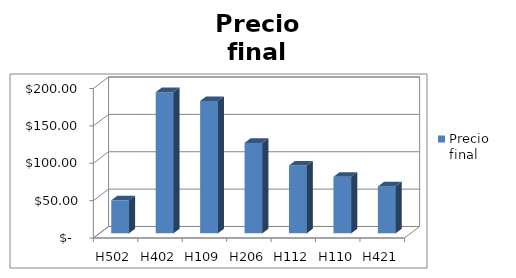
| Category | Precio
final |
|---|---|
| H502 | 44.1 |
| H402 | 188.8 |
| H109 | 177 |
| H206 | 120.96 |
| H112 | 90.72 |
| H110 | 75.52 |
| H421 | 62.72 |